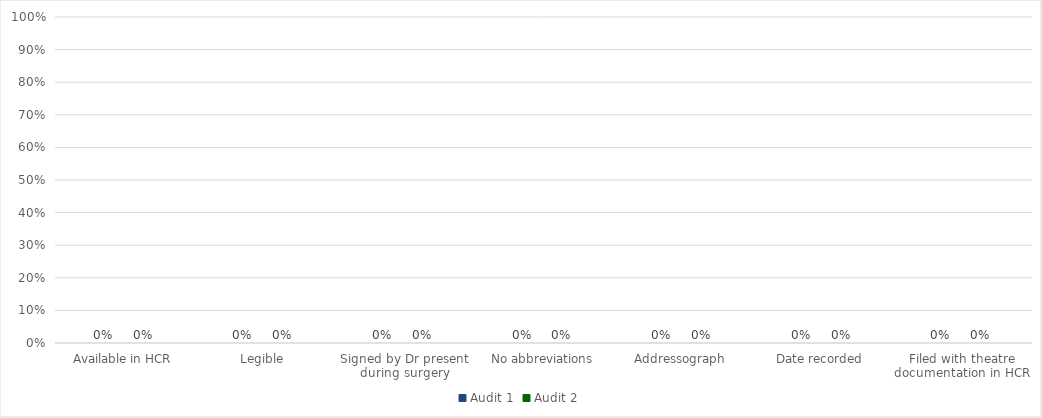
| Category | Audit 1 | Audit 2 |
|---|---|---|
| Available in HCR | 0 | 0 |
| Legible | 0 | 0 |
| Signed by Dr present during surgery | 0 | 0 |
| No abbreviations | 0 | 0 |
| Addressograph  | 0 | 0 |
| Date recorded  | 0 | 0 |
| Filed with theatre documentation in HCR | 0 | 0 |